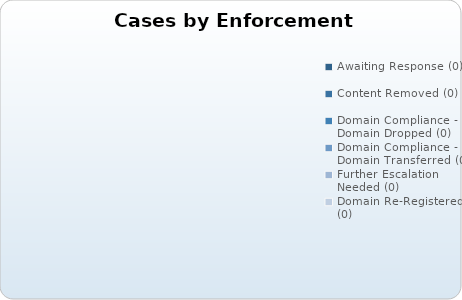
| Category | # Cases |
|---|---|
| Awaiting Response (0) | 0 |
| Content Removed (0) | 0 |
| Domain Compliance - Domain Dropped (0) | 0 |
| Domain Compliance - Domain Transferred (0) | 0 |
| Further Escalation Needed (0) | 0 |
| Domain Re-Registered (0) | 0 |